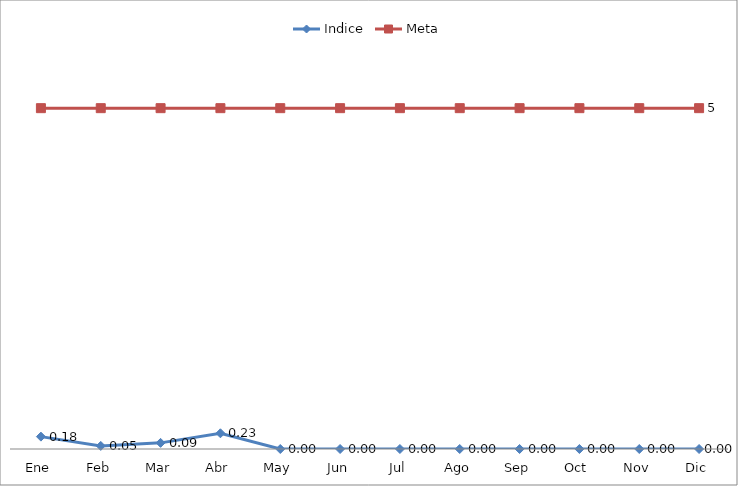
| Category | Indice | Meta |
|---|---|---|
| Ene | 0.181 | 5 |
| Feb | 0.045 | 5 |
| Mar | 0.09 | 5 |
| Abr | 0.231 | 5 |
| May | 0 | 5 |
| Jun | 0 | 5 |
| Jul | 0 | 5 |
| Ago | 0 | 5 |
| Sep | 0 | 5 |
| Oct | 0 | 5 |
| Nov | 0 | 5 |
| Dic | 0 | 5 |